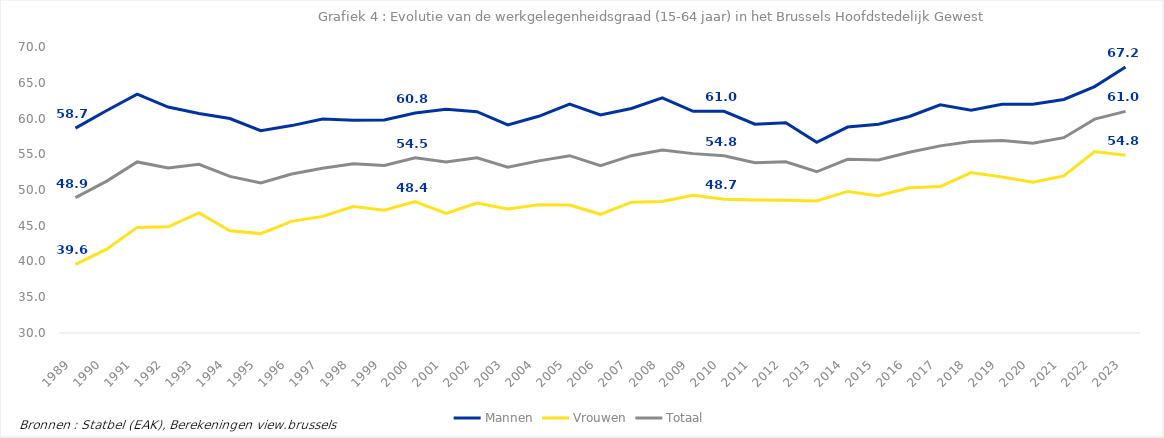
| Category | Mannen | Vrouwen | Totaal |
|---|---|---|---|
| 1989.0 | 58.651 | 39.606 | 48.934 |
| 1990.0 | 61.08 | 41.692 | 51.204 |
| 1991.0 | 63.417 | 44.77 | 53.927 |
| 1992.0 | 61.596 | 44.844 | 53.078 |
| 1993.0 | 60.7 | 46.8 | 53.6 |
| 1994.0 | 60 | 44.3 | 51.9 |
| 1995.0 | 58.3 | 43.9 | 51 |
| 1996.0 | 59.008 | 45.612 | 52.231 |
| 1997.0 | 59.93 | 46.308 | 53.039 |
| 1998.0 | 59.751 | 47.696 | 53.656 |
| 1999.0 | 59.797 | 47.185 | 53.427 |
| 2000.0 | 60.781 | 48.381 | 54.514 |
| 2001.0 | 61.277 | 46.71 | 53.924 |
| 2002.0 | 60.948 | 48.169 | 54.505 |
| 2003.0 | 59.11 | 47.355 | 53.194 |
| 2004.0 | 60.305 | 47.938 | 54.071 |
| 2005.0 | 62 | 47.9 | 54.8 |
| 2006.0 | 60.5 | 46.6 | 53.4 |
| 2007.0 | 61.4 | 48.3 | 54.8 |
| 2008.0 | 62.9 | 48.4 | 55.6 |
| 2009.0 | 61.01 | 49.259 | 55.088 |
| 2010.0 | 61 | 48.7 | 54.8 |
| 2011.0 | 59.2 | 48.6 | 53.8 |
| 2012.0 | 59.417 | 48.562 | 53.956 |
| 2013.0 | 56.679 | 48.465 | 52.549 |
| 2014.0 | 58.8 | 49.8 | 54.3 |
| 2015.0 | 59.2 | 49.2 | 54.2 |
| 2016.0 | 60.277 | 50.301 | 55.271 |
| 2017.0 | 61.905 | 50.483 | 56.173 |
| 2018.0 | 61.168 | 52.432 | 56.794 |
| 2019.0 | 62.006 | 51.822 | 56.912 |
| 2020.0 | 62.008 | 51.091 | 56.55 |
| 2021.0 | 62.66 | 51.967 | 57.316 |
| 2022.0 | 64.457 | 55.377 | 59.908 |
| 2023.0 | 67.196 | 54.846 | 60.999 |